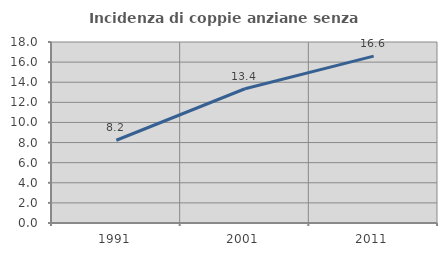
| Category | Incidenza di coppie anziane senza figli  |
|---|---|
| 1991.0 | 8.229 |
| 2001.0 | 13.351 |
| 2011.0 | 16.595 |